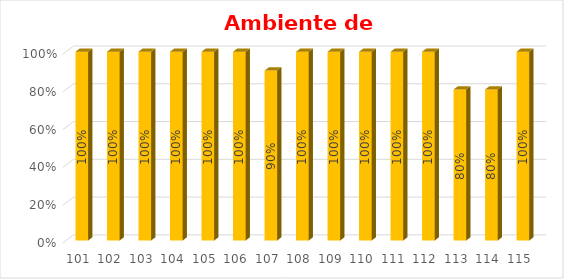
| Category | % Avance |
|---|---|
| 101.0 | 1 |
| 102.0 | 1 |
| 103.0 | 1 |
| 104.0 | 1 |
| 105.0 | 1 |
| 106.0 | 1 |
| 107.0 | 0.9 |
| 108.0 | 1 |
| 109.0 | 1 |
| 110.0 | 1 |
| 111.0 | 1 |
| 112.0 | 1 |
| 113.0 | 0.8 |
| 114.0 | 0.8 |
| 115.0 | 1 |